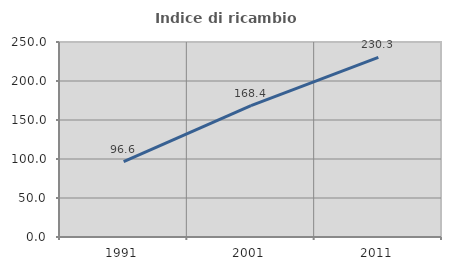
| Category | Indice di ricambio occupazionale  |
|---|---|
| 1991.0 | 96.643 |
| 2001.0 | 168.398 |
| 2011.0 | 230.337 |